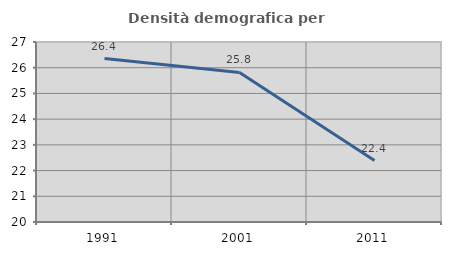
| Category | Densità demografica |
|---|---|
| 1991.0 | 26.358 |
| 2001.0 | 25.815 |
| 2011.0 | 22.391 |